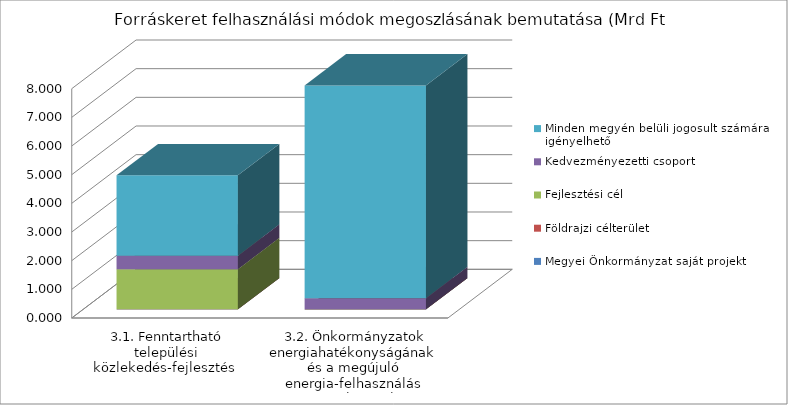
| Category | Megyei Önkormányzat saját projekt | Földrajzi célterület  | Fejlesztési cél  | Kedvezményezetti csoport | Minden megyén belüli jogosult számára igényelhető |
|---|---|---|---|---|---|
| 3.1. Fenntartható települési közlekedés-fejlesztés | 0 | 0 | 1.403 | 0.468 | 2.806 |
| 3.2. Önkormányzatok energiahatékonyságának és a megújuló energia-felhasználás arányának növelése | 0 | 0 | 0 | 0.39 | 7.42 |